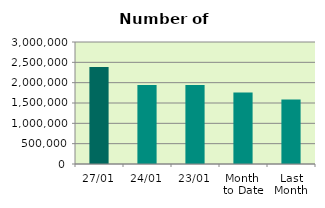
| Category | Series 0 |
|---|---|
| 27/01 | 2387568 |
| 24/01 | 1944482 |
| 23/01 | 1940890 |
| Month 
to Date | 1760687 |
| Last
Month | 1583843.3 |